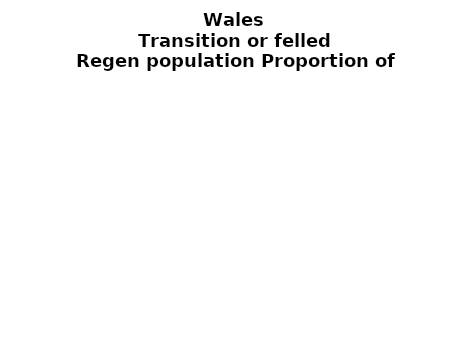
| Category | Transition or felled |
|---|---|
| None | 0.003 |
| Seedlings only | 0 |
| Seedlings, saplings only | 0.099 |
| Seedlings, saplings, <7 cm trees | 0.181 |
| Saplings only | 0.255 |
| <7 cm trees, seedlings only | 0 |
| <7 cm trees, saplings only | 0.462 |
| <7 cm Trees only | 0 |